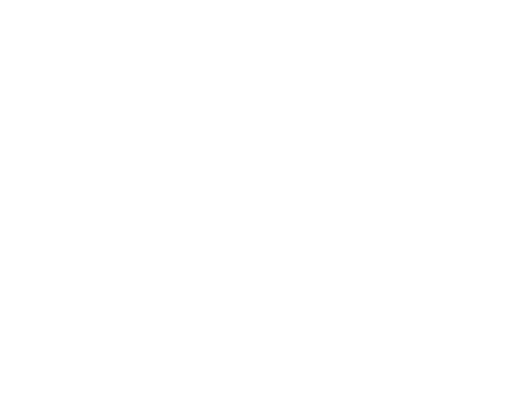
| Category | Series 0 | Series 1 | Series 2 |
|---|---|---|---|
| Impuestos | 2217810.42 | 0.058 |  |
| Cuotas y Aportaciones de Seguridad Social | 0 | 0 |  |
| Contribuciones de Mejoras | 56511 | 0.001 |  |
| Derechos | 938092.95 | 0.024 |  |
| Productos | 33906.6 | 0.001 |  |
| Aprovechamientos | 192137.4 | 0.005 |  |
| Ingresos por Ventas de Bienes y Servicios | 0 | 0 |  |
| Participaciones y Aportaciones | 31590745.15 | 0.821 |  |
| Transferencias, Asignaciones, Subsidios y Otras Ayudas | 3467250 | 0.09 |  |
| Ingresos Derivados de Financiamientos | 0 | 0 |  |